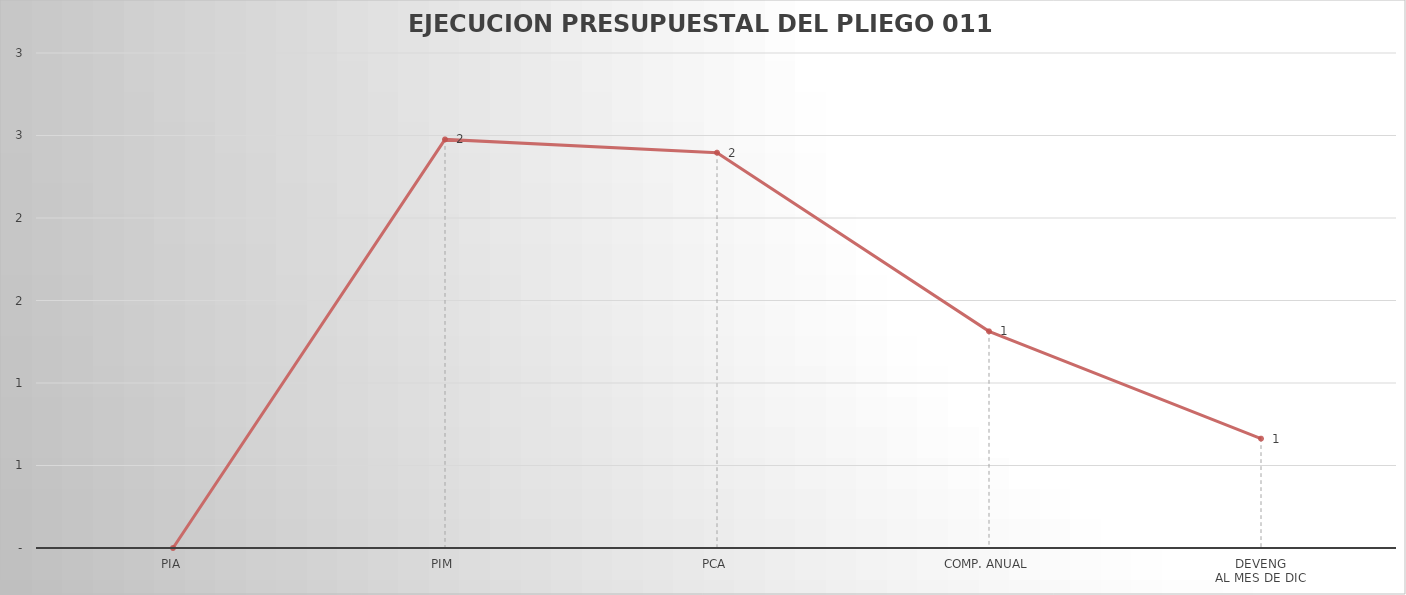
| Category | Series 0 |
|---|---|
| PIA | 0 |
| PIM | 2.476 |
| PCA | 2.396 |
| COMP. ANUAL | 1.313 |
| DEVENG
AL MES DE DIC | 0.663 |